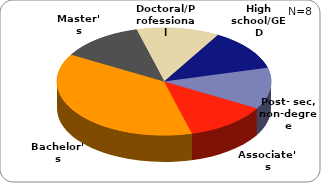
| Category | Series 0 |
|---|---|
| High school/GED | 0.125 |
| Post- sec, non-degree | 0.125 |
| Associate's | 0.125 |
| Bachelor's | 0.375 |
| Master's | 0.125 |
| Doctoral/Professional | 0.125 |